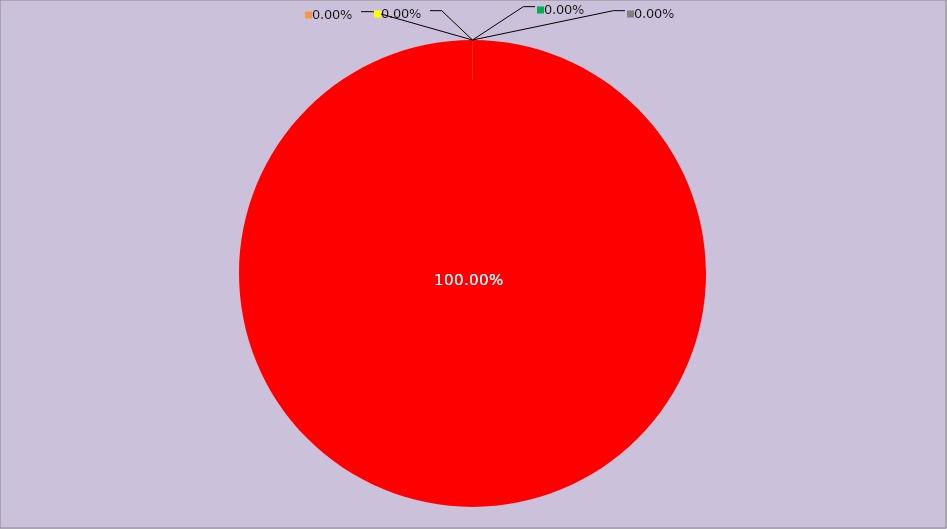
| Category | Année 2027 |
|---|---|
| Mesures non appliquées | 168 |
| Mesures appliquées mais peu ou pas documentées | 0 |
| Mesures appliquées et documentées | 0 |
| Mesures appliquées, documentées et contrôlées | 0 |
| Mesures non applicables | 0 |